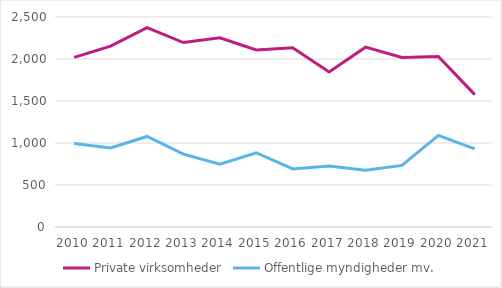
| Category | Private virksomheder | Offentlige myndigheder mv. |
|---|---|---|
| 2010.0 | 2020 | 994 |
| 2011.0 | 2153 | 941 |
| 2012.0 | 2374 | 1078 |
| 2013.0 | 2196 | 867 |
| 2014.0 | 2252 | 749 |
| 2015.0 | 2108 | 884 |
| 2016.0 | 2135 | 691 |
| 2017.0 | 1845 | 727 |
| 2018.0 | 2141 | 675 |
| 2019.0 | 2019 | 733 |
| 2020.0 | 2029 | 1091 |
| 2021.0 | 1576 | 929 |